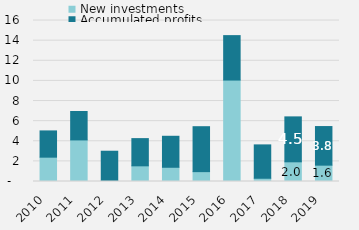
| Category | New investments | Accumulated profits |
|---|---|---|
| 2010 | 2418.192 | 2611 |
| 2011 | 4133.294 | 2827 |
| 2012 | 98.062 | 2911 |
| 2013 | 1557.532 | 2706 |
| 2014 | 1414.164 | 3082 |
| 2015 | 980.288 | 4468 |
| 2016 | 10083.695 | 4419 |
| 2017 | 322.448 | 3317 |
| 2018 | 1956.978 | 4467 |
| 2019 | 1624 | 3839 |